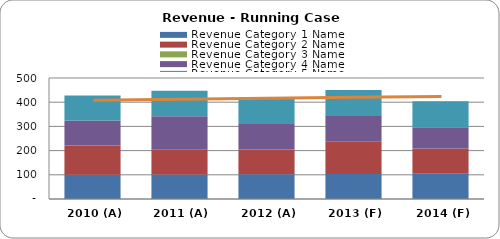
| Category | Revenue Category 1 Name | Revenue Category 2 Name | Revenue Category 3 Name | Revenue Category 4 Name | Revenue Category 5 Name |
|---|---|---|---|---|---|
| 2010 (A)  | 100 | 121 | 0 | 103 | 104 |
| 2011 (A)  | 101 | 102 | 0 | 139 | 105 |
| 2012 (A)  | 102 | 103 | 0 | 105 | 106 |
| 2013 (F)  | 103 | 134 | 0 | 106 | 107 |
| 2014 (F)  | 104 | 105 | 0 | 87 | 108 |